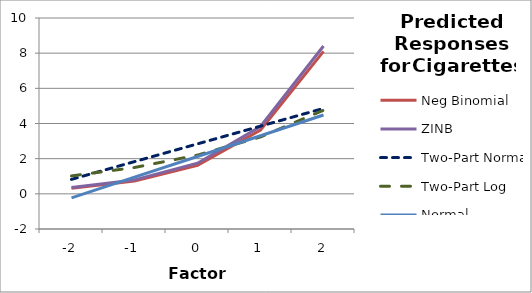
| Category | Neg Binomial | ZINB | Two-Part Normal | Two-Part Log | Normal |
|---|---|---|---|---|---|
| -2.0 | 0.324 | 0.361 | 0.823 | 1.019 | -0.232 |
| -1.0 | 0.724 | 0.793 | 1.832 | 1.498 | 0.947 |
| 0.0 | 1.619 | 1.742 | 2.841 | 2.201 | 2.126 |
| 1.0 | 3.622 | 3.827 | 3.85 | 3.235 | 3.305 |
| 2.0 | 8.101 | 8.406 | 4.859 | 4.754 | 4.484 |